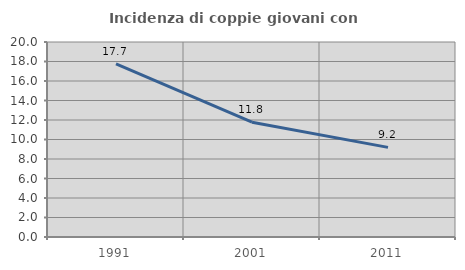
| Category | Incidenza di coppie giovani con figli |
|---|---|
| 1991.0 | 17.75 |
| 2001.0 | 11.779 |
| 2011.0 | 9.192 |